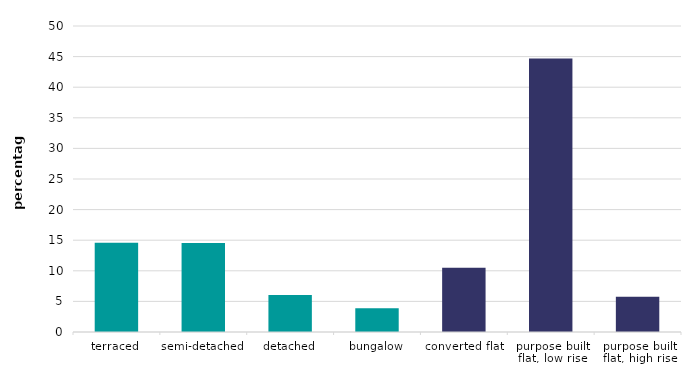
| Category | Series 0 |
|---|---|
| terraced | 14.572 |
| semi-detached | 14.526 |
| detached | 6.053 |
| bungalow | 3.888 |
| converted flat | 10.515 |
| purpose built flat, low rise | 44.673 |
| purpose built flat, high rise | 5.774 |